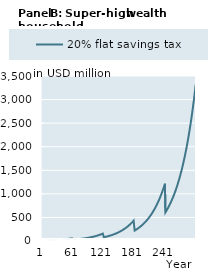
| Category | 20% flat savings tax |
|---|---|
| 1 | 10000000 |
| 2 | 10314750 |
| 3 | 10638690.7 |
| 4 | 10972090.468 |
| 5 | 11315225.51 |
| 6 | 11668380.095 |
| 7 | 12031846.794 |
| 8 | 12405926.72 |
| 9 | 12790929.78 |
| 10 | 13187174.93 |
| 11 | 13594990.438 |
| 12 | 14014714.159 |
| 13 | 14446693.812 |
| 14 | 14891287.271 |
| 15 | 15348862.86 |
| 16 | 15819799.655 |
| 17 | 16304487.805 |
| 18 | 16803328.849 |
| 19 | 17316736.052 |
| 20 | 17845134.744 |
| 21 | 18388962.679 |
| 22 | 18948670.389 |
| 23 | 19524721.564 |
| 24 | 20117593.434 |
| 25 | 20727777.162 |
| 26 | 21355778.255 |
| 27 | 22002116.981 |
| 28 | 22667328.796 |
| 29 | 23351964.797 |
| 30 | 24056592.169 |
| 31 | 24781794.661 |
| 32 | 25528173.065 |
| 33 | 26296345.718 |
| 34 | 27086949.013 |
| 35 | 27900637.924 |
| 36 | 28738086.552 |
| 37 | 29599988.679 |
| 38 | 30487058.349 |
| 39 | 31400030.452 |
| 40 | 32339661.341 |
| 41 | 33306729.453 |
| 42 | 34290485.953 |
| 43 | 35302968.142 |
| 44 | 36345014.812 |
| 45 | 37417489.245 |
| 46 | 38521279.931 |
| 47 | 39657301.305 |
| 48 | 40826494.503 |
| 49 | 42029828.142 |
| 50 | 43268299.124 |
| 51 | 44542933.458 |
| 52 | 45854787.115 |
| 53 | 47204946.899 |
| 54 | 48594531.349 |
| 55 | 50024691.664 |
| 56 | 51496612.661 |
| 57 | 53011513.75 |
| 58 | 54570649.952 |
| 59 | 56175312.93 |
| 60 | 57826832.068 |
| 61 | 28913416.034 |
| 62 | 29780437.782 |
| 63 | 30672776.565 |
| 64 | 31591171.641 |
| 65 | 32536383.853 |
| 66 | 33509196.262 |
| 67 | 34510414.792 |
| 68 | 35540868.904 |
| 69 | 36601412.276 |
| 70 | 37692923.515 |
| 71 | 38816306.881 |
| 72 | 39972493.042 |
| 73 | 41162439.839 |
| 74 | 42387133.083 |
| 75 | 43647587.369 |
| 76 | 44944846.92 |
| 77 | 46279986.45 |
| 78 | 47654112.054 |
| 79 | 49068362.126 |
| 80 | 50523908.3 |
| 81 | 52021956.423 |
| 82 | 53563747.55 |
| 83 | 55150558.979 |
| 84 | 56783705.301 |
| 85 | 58464539.495 |
| 86 | 60194454.049 |
| 87 | 61974882.107 |
| 88 | 63807298.664 |
| 89 | 65693221.785 |
| 90 | 67634213.862 |
| 91 | 69631882.906 |
| 92 | 71687883.887 |
| 93 | 73803920.097 |
| 94 | 75981744.564 |
| 95 | 78223161.505 |
| 96 | 80530027.821 |
| 97 | 82904254.633 |
| 98 | 85347808.868 |
| 99 | 87862714.887 |
| 100 | 90451056.162 |
| 101 | 93114977.002 |
| 102 | 95845134.331 |
| 103 | 98655012.253 |
| 104 | 101546938.611 |
| 105 | 104523309.218 |
| 106 | 107586589.847 |
| 107 | 110739318.271 |
| 108 | 113984106.364 |
| 109 | 117323642.27 |
| 110 | 120760692.625 |
| 111 | 124298104.849 |
| 112 | 127938809.511 |
| 113 | 131685822.748 |
| 114 | 135542248.773 |
| 115 | 139511282.437 |
| 116 | 143596211.884 |
| 117 | 147800421.271 |
| 118 | 152127393.572 |
| 119 | 156580713.464 |
| 120 | 161164070.298 |
| 121 | 80582035.149 |
| 122 | 82957780.575 |
| 123 | 85402897.768 |
| 124 | 87919412.383 |
| 125 | 90509409.224 |
| 126 | 93175033.974 |
| 127 | 95918494.966 |
| 128 | 98742065.019 |
| 129 | 101648083.317 |
| 130 | 104638957.35 |
| 131 | 107717164.905 |
| 132 | 110885256.12 |
| 133 | 114145855.599 |
| 134 | 117501664.582 |
| 135 | 120955463.188 |
| 136 | 124510112.713 |
| 137 | 128168558.004 |
| 138 | 131933829.898 |
| 139 | 135809047.731 |
| 140 | 139797421.925 |
| 141 | 143902256.645 |
| 142 | 148126952.539 |
| 143 | 152475009.553 |
| 144 | 156950029.832 |
| 145 | 161555720.703 |
| 146 | 166295897.748 |
| 147 | 171174487.962 |
| 148 | 176195533.011 |
| 149 | 181363192.574 |
| 150 | 186681747.798 |
| 151 | 192155604.833 |
| 152 | 197789298.494 |
| 153 | 203587496.01 |
| 154 | 209555000.894 |
| 155 | 215696756.92 |
| 156 | 222017852.222 |
| 157 | 228523523.507 |
| 158 | 235219160.393 |
| 159 | 242110309.877 |
| 160 | 249202680.925 |
| 161 | 256502149.208 |
| 162 | 264003211.965 |
| 163 | 271723305.755 |
| 164 | 279668826.283 |
| 165 | 287846356.01 |
| 166 | 296262669.606 |
| 167 | 304924739.558 |
| 168 | 313839741.953 |
| 169 | 323015062.418 |
| 170 | 332458302.241 |
| 171 | 342177284.666 |
| 172 | 352180061.378 |
| 173 | 362474919.171 |
| 174 | 373070386.811 |
| 175 | 383975242.105 |
| 176 | 395198519.175 |
| 177 | 406749515.935 |
| 178 | 418637801.8 |
| 179 | 430873225.613 |
| 180 | 443465923.8 |
| 181 | 221732961.9 |
| 182 | 228230314.388 |
| 183 | 234917389.568 |
| 184 | 241799727.343 |
| 185 | 248883029.382 |
| 186 | 256173163.84 |
| 187 | 263676170.224 |
| 188 | 271398264.394 |
| 189 | 279345843.715 |
| 190 | 287525492.351 |
| 191 | 295943986.728 |
| 192 | 304608301.14 |
| 193 | 313525613.533 |
| 194 | 322703311.449 |
| 195 | 332148998.143 |
| 196 | 341870498.889 |
| 197 | 351875867.456 |
| 198 | 362173392.786 |
| 199 | 372771605.855 |
| 200 | 383679286.746 |
| 201 | 394905471.919 |
| 202 | 406459461.699 |
| 203 | 418350827.981 |
| 204 | 430589422.158 |
| 205 | 443185383.285 |
| 206 | 456149146.477 |
| 207 | 469491451.554 |
| 208 | 483223351.939 |
| 209 | 497356223.816 |
| 210 | 511901775.551 |
| 211 | 526872057.398 |
| 212 | 542279471.474 |
| 213 | 558136782.041 |
| 214 | 574457126.076 |
| 215 | 591254024.158 |
| 216 | 608541391.663 |
| 217 | 626333550.3 |
| 218 | 644645239.968 |
| 219 | 663491630.975 |
| 220 | 682888336.6 |
| 221 | 702851426.029 |
| 222 | 723385887.669 |
| 223 | 744519955.589 |
| 224 | 766271138.292 |
| 225 | 788657455.53 |
| 226 | 811697453.231 |
| 227 | 835410218.866 |
| 228 | 859815397.257 |
| 229 | 884933206.856 |
| 230 | 910784456.497 |
| 231 | 937390562.626 |
| 232 | 964773567.055 |
| 233 | 992956155.213 |
| 234 | 1021961674.945 |
| 235 | 1051814155.854 |
| 236 | 1082538329.205 |
| 237 | 1114159648.417 |
| 238 | 1146704310.151 |
| 239 | 1180199276.008 |
| 240 | 1214672294.867 |
| 241 | 607336147.433 |
| 242 | 625093112.939 |
| 243 | 643368581.836 |
| 244 | 662177694.426 |
| 245 | 681536033.103 |
| 246 | 701459635.27 |
| 247 | 721965006.62 |
| 248 | 743069134.813 |
| 249 | 764789503.55 |
| 250 | 787144107.053 |
| 251 | 810151464.979 |
| 252 | 833830637.757 |
| 253 | 858201242.379 |
| 254 | 883283468.656 |
| 255 | 909098095.941 |
| 256 | 935666510.343 |
| 257 | 963010722.445 |
| 258 | 991153385.54 |
| 259 | 1020117814.398 |
| 260 | 1049928004.578 |
| 261 | 1080608652.312 |
| 262 | 1112185174.96 |
| 263 | 1144683732.068 |
| 264 | 1178131247.045 |
| 265 | 1212555429.458 |
| 266 | 1247984797.999 |
| 267 | 1284448704.1 |
| 268 | 1321977356.26 |
| 269 | 1360601845.063 |
| 270 | 1400354168.939 |
| 271 | 1441267260.672 |
| 272 | 1483375014.683 |
| 273 | 1526712315.112 |
| 274 | 1571315064.713 |
| 275 | 1617220214.603 |
| 276 | 1664465794.869 |
| 277 | 1713090946.079 |
| 278 | 1763135951.705 |
| 279 | 1814642271.495 |
| 280 | 1867652575.822 |
| 281 | 1922210781.036 |
| 282 | 1978350535.843 |
| 283 | 2036129571.489 |
| 284 | 2095595754.977 |
| 285 | 2156798351.022 |
| 286 | 2219788062.872 |
| 287 | 2284617074.308 |
| 288 | 2351339092.878 |
| 289 | 2420009394.39 |
| 290 | 2490684868.706 |
| 291 | 2563424066.872 |
| 292 | 2638287249.625 |
| 293 | 2715336437.314 |
| 294 | 2794635461.283 |
| 295 | 2876250016.753 |
| 296 | 2960247717.242 |
| 297 | 3046698150.585 |
| 298 | 3135672936.582 |
| 299 | 3227245786.331 |
| 300 | 3321492563.291 |